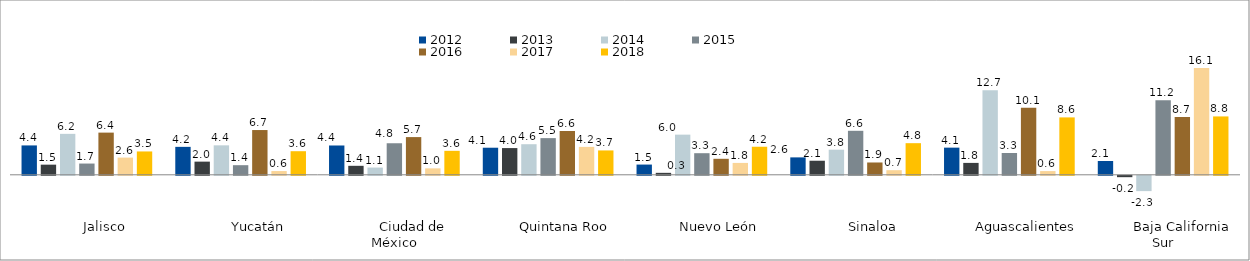
| Category | 2012 | 2013 | 2014 | 2015 | 2016 | 2017 | 2018 |
|---|---|---|---|---|---|---|---|
|           Jalisco | 4.424 | 1.527 | 6.167 | 1.695 | 6.353 | 2.59 | 3.516 |
|           Yucatán | 4.208 | 1.983 | 4.437 | 1.448 | 6.741 | 0.563 | 3.553 |
|           Ciudad de México | 4.414 | 1.353 | 1.09 | 4.752 | 5.679 | 0.969 | 3.609 |
|           Quintana Roo | 4.078 | 4.025 | 4.607 | 5.524 | 6.594 | 4.203 | 3.669 |
|           Nuevo León | 1.542 | 0.295 | 6.047 | 3.253 | 2.41 | 1.788 | 4.225 |
|           Sinaloa | 2.623 | 2.118 | 3.78 | 6.626 | 1.855 | 0.696 | 4.763 |
|           Aguascalientes | 4.09 | 1.792 | 12.723 | 3.287 | 10.089 | 0.56 | 8.644 |
|           Baja California Sur | 2.077 | -0.207 | -2.306 | 11.236 | 8.696 | 16.095 | 8.792 |